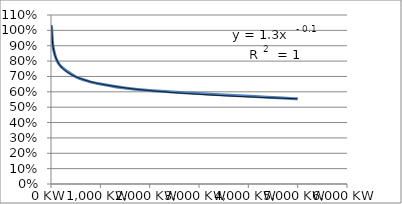
| Category | Series 0 |
|---|---|
| 10.0 | 1.033 |
| 30.0 | 0.925 |
| 50.0 | 0.879 |
| 100.0 | 0.82 |
| 200.0 | 0.765 |
| 500.0 | 0.698 |
| 713.3152173913043 | 0.674 |
| 1000.0 | 0.652 |
| 2000.0 | 0.608 |
| 5000.0 | 0.555 |